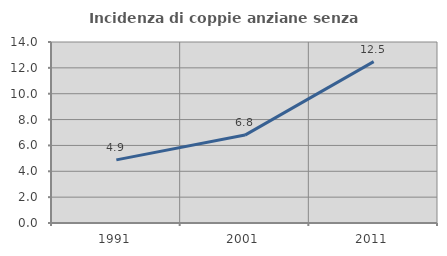
| Category | Incidenza di coppie anziane senza figli  |
|---|---|
| 1991.0 | 4.883 |
| 2001.0 | 6.799 |
| 2011.0 | 12.481 |